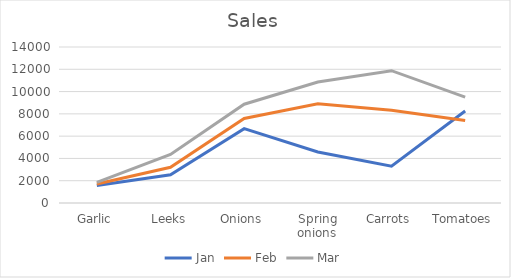
| Category | Jan | Feb | Mar |
|---|---|---|---|
| Garlic | 1566 | 1709 | 1854 |
| Leeks | 2532 | 3209 | 4356 |
| Onions | 6670 | 7580 | 8864 |
| Spring onions | 4577 | 8908 | 10858 |
| Carrots | 3300 | 8321 | 11876 |
| Tomatoes | 8254 | 7396 | 9508 |